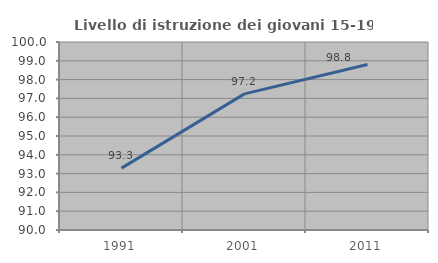
| Category | Livello di istruzione dei giovani 15-19 anni |
|---|---|
| 1991.0 | 93.292 |
| 2001.0 | 97.241 |
| 2011.0 | 98.801 |